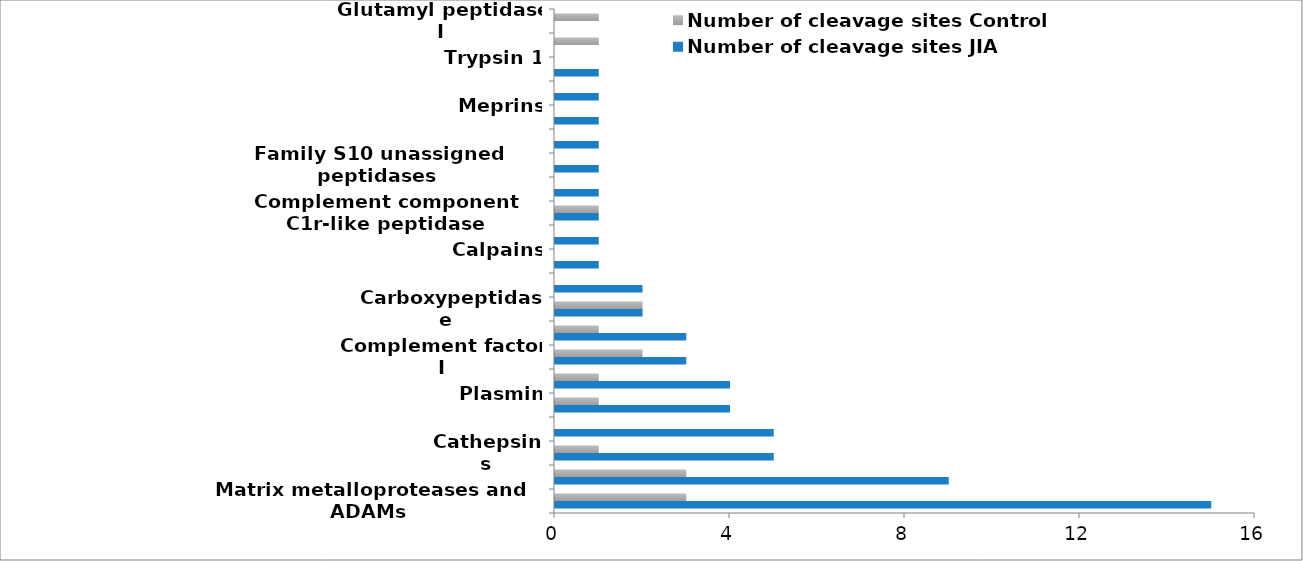
| Category | Number of cleavage sites JIA  | Number of cleavage sites Control |
|---|---|---|
| Matrix metalloproteases and ADAMs | 15 | 3 |
| Unknown peptidase | 9 | 3 |
| Cathepsins | 5 | 1 |
| Kallikrein-related peptidase | 5 | 0 |
| Plasmin | 4 | 1 |
| Signal peptidase complex (animal) | 4 | 1 |
| Complement factor I | 3 | 2 |
| Thrombin | 3 | 1 |
| Carboxypeptidase  | 2 | 2 |
| Coagulation factor Xa | 2 | 0 |
| Calpains | 1 | 0 |
| Chymase (Homo sapiens-type) | 1 | 0 |
| Complement component C1r-like peptidase | 1 | 1 |
| Elastase | 1 | 0 |
| Family S10 unassigned peptidases | 1 | 0 |
| Fibroblast activation protein alpha subunit | 1 | 0 |
| Meprins | 1 | 0 |
| Peptidase 1 (mite)  | 1 | 0 |
| Trypsin 1 | 1 | 0 |
| Fibrolase | 0 | 1 |
| Glutamyl peptidase I | 0 | 1 |